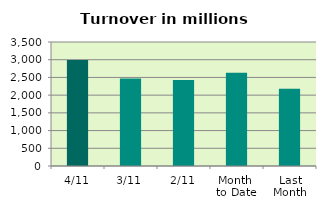
| Category | Series 0 |
|---|---|
| 4/11 | 2990.072 |
| 3/11 | 2467.779 |
| 2/11 | 2430.829 |
| Month 
to Date | 2629.56 |
| Last
Month | 2179.795 |